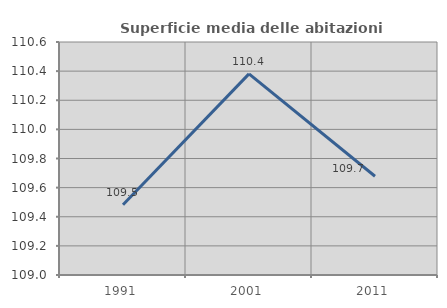
| Category | Superficie media delle abitazioni occupate |
|---|---|
| 1991.0 | 109.483 |
| 2001.0 | 110.381 |
| 2011.0 | 109.678 |